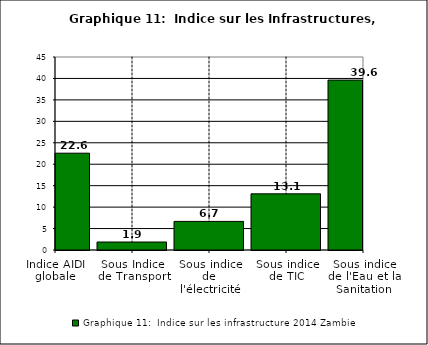
| Category | Graphique 11:  Indice sur les infrastructure 2014 |
|---|---|
| Indice AIDI globale | 22.572 |
| Sous Indice de Transport | 1.859 |
| Sous indice de l'électricité | 6.667 |
| Sous indice de TIC | 13.092 |
| Sous indice de l'Eau et la Sanitation | 39.617 |